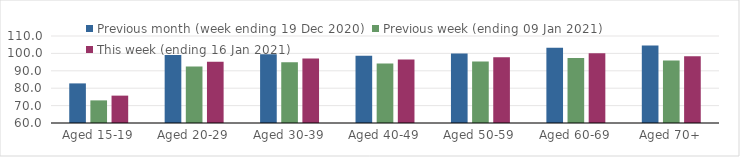
| Category | Previous month (week ending 19 Dec 2020) | Previous week (ending 09 Jan 2021) | This week (ending 16 Jan 2021) |
|---|---|---|---|
| Aged 15-19 | 82.76 | 73 | 75.73 |
| Aged 20-29 | 99.02 | 92.52 | 95.13 |
| Aged 30-39 | 99.46 | 94.86 | 97.1 |
| Aged 40-49 | 98.68 | 94.24 | 96.55 |
| Aged 50-59 | 99.96 | 95.36 | 97.79 |
| Aged 60-69 | 103.24 | 97.38 | 100.07 |
| Aged 70+ | 104.53 | 95.91 | 98.41 |